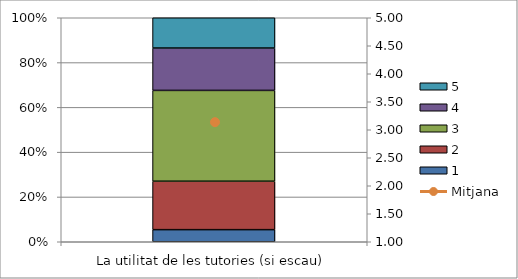
| Category | 1 | 2 | 3 | 4 | 5 |
|---|---|---|---|---|---|
| La utilitat de les tutories (si escau) | 2 | 8 | 15 | 7 | 5 |